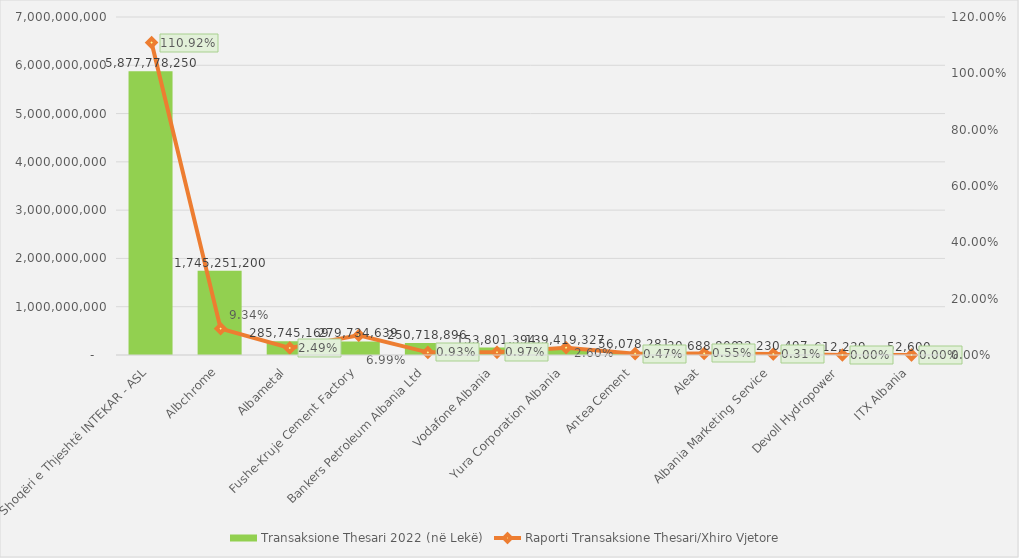
| Category | Transaksione Thesari 2022 (në Lekë) |
|---|---|
| Shoqëri e Thjeshtë INTEKAR - ASL | 5877778250 |
| Albchrome | 1745251200 |
| Albametal | 285745169 |
| Fushe-Kruje Cement Factory | 279734639 |
| Bankers Petroleum Albania Ltd | 250718896 |
| Vodafone Albania | 153801394 |
| Yura Corporation Albania | 139419327 |
| Antea Cement | 56078281 |
| Aleat | 30688800 |
| Albania Marketing Service | 22230497 |
| Devoll Hydropower | 612239 |
| ITX Albania | 52600 |